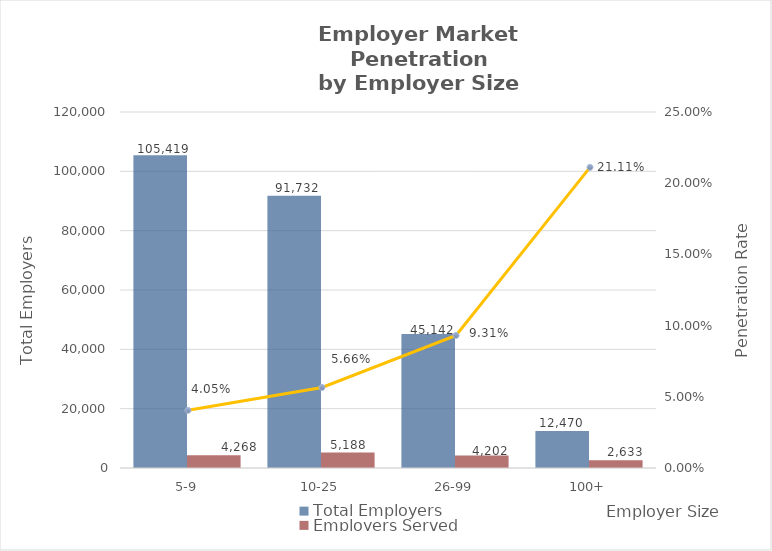
| Category | Total Employers | Employers Served |
|---|---|---|
| 5-9 | 105419 | 4268 |
| 10-25 | 91732 | 5188 |
| 26-99 | 45142 | 4202 |
| 100+ | 12470 | 2633 |